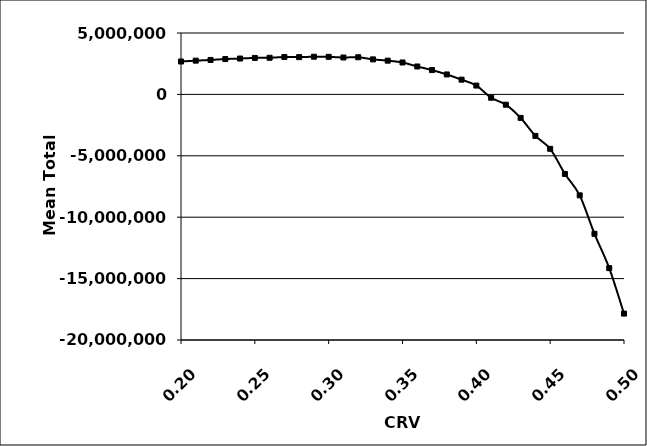
| Category | Series 1 |
|---|---|
| 0.2 | 2678175.552 |
| 0.21 | 2747904.464 |
| 0.22 | 2805384.471 |
| 0.23 | 2878048.027 |
| 0.24 | 2920133.886 |
| 0.25 | 2971378.042 |
| 0.26 | 2980896.725 |
| 0.27 | 3046140.292 |
| 0.28 | 3034912.777 |
| 0.29 | 3067884.678 |
| 0.3 | 3059409.178 |
| 0.31 | 3003884.213 |
| 0.32 | 3025375.566 |
| 0.33 | 2851418.139 |
| 0.34 | 2747474.353 |
| 0.35 | 2599874.359 |
| 0.36 | 2273474.877 |
| 0.37 | 1980381.095 |
| 0.38 | 1624574.588 |
| 0.39 | 1199930.679 |
| 0.4 | 719843.397 |
| 0.41 | -271845.924 |
| 0.42 | -839341.171 |
| 0.43 | -1912650.933 |
| 0.44 | -3379184.695 |
| 0.45 | -4429724.516 |
| 0.46 | -6476284.251 |
| 0.47 | -8220521.153 |
| 0.48 | -11351579.752 |
| 0.49 | -14147976.626 |
| 0.5 | -17850626.908 |